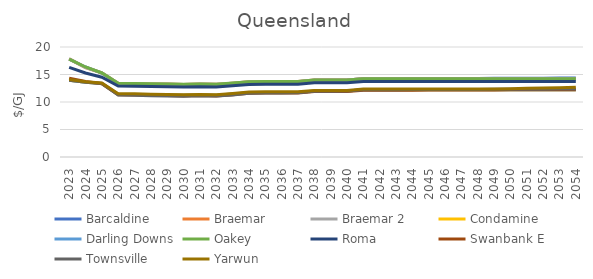
| Category | Barcaldine | Braemar | Braemar 2 | Condamine | Darling Downs | Oakey | Roma | Swanbank E | Townsville | Yarwun |
|---|---|---|---|---|---|---|---|---|---|---|
| 2023.0 | 17.787 | 17.827 | 17.827 | 13.967 | 13.967 | 17.787 | 16.302 | 14.339 | 13.967 | 14.078 |
| 2024.0 | 16.365 | 16.272 | 16.272 | 13.568 | 13.568 | 16.365 | 15.284 | 13.721 | 13.568 | 13.679 |
| 2025.0 | 15.277 | 15.318 | 15.318 | 13.348 | 13.348 | 15.277 | 14.503 | 13.317 | 13.348 | 13.459 |
| 2026.0 | 13.289 | 13.387 | 13.387 | 11.399 | 11.399 | 13.399 | 12.899 | 11.307 | 11.289 | 11.511 |
| 2027.0 | 13.224 | 13.359 | 13.359 | 11.372 | 11.372 | 13.372 | 12.872 | 11.266 | 11.224 | 11.486 |
| 2028.0 | 13.136 | 13.286 | 13.286 | 11.299 | 11.299 | 13.299 | 12.799 | 11.234 | 11.136 | 11.41 |
| 2029.0 | 13.113 | 13.257 | 13.257 | 11.271 | 11.271 | 13.271 | 12.771 | 11.166 | 11.113 | 11.386 |
| 2030.0 | 13.058 | 13.196 | 13.196 | 11.207 | 11.207 | 13.207 | 12.707 | 11.102 | 11.058 | 11.323 |
| 2031.0 | 13.126 | 13.263 | 13.263 | 11.27 | 11.27 | 13.27 | 12.77 | 11.166 | 11.126 | 11.386 |
| 2032.0 | 13.072 | 13.211 | 13.211 | 11.215 | 11.215 | 13.215 | 12.715 | 11.11 | 11.072 | 11.326 |
| 2033.0 | 13.29 | 13.432 | 13.432 | 11.435 | 11.435 | 13.435 | 12.935 | 11.331 | 11.29 | 11.546 |
| 2034.0 | 13.572 | 13.691 | 13.691 | 11.696 | 11.696 | 13.696 | 13.196 | 11.592 | 11.572 | 11.807 |
| 2035.0 | 13.636 | 13.744 | 13.744 | 11.747 | 11.747 | 13.747 | 13.247 | 11.642 | 11.636 | 11.858 |
| 2036.0 | 13.653 | 13.746 | 13.746 | 11.747 | 11.747 | 13.747 | 13.247 | 11.642 | 11.653 | 11.858 |
| 2037.0 | 13.672 | 13.747 | 13.747 | 11.747 | 11.747 | 13.747 | 13.247 | 11.642 | 11.672 | 11.858 |
| 2038.0 | 13.942 | 13.996 | 13.996 | 11.997 | 11.997 | 13.997 | 13.497 | 11.892 | 11.942 | 12.108 |
| 2039.0 | 13.974 | 13.992 | 13.992 | 11.997 | 11.997 | 13.997 | 13.497 | 11.892 | 11.974 | 12.108 |
| 2040.0 | 13.996 | 13.993 | 13.993 | 11.997 | 11.997 | 13.997 | 13.497 | 11.892 | 11.996 | 12.108 |
| 2041.0 | 14.246 | 14.244 | 14.244 | 12.247 | 12.247 | 14.247 | 13.747 | 12.142 | 12.246 | 12.358 |
| 2042.0 | 14.246 | 14.244 | 14.244 | 12.247 | 12.247 | 14.247 | 13.747 | 12.142 | 12.246 | 12.358 |
| 2043.0 | 14.246 | 14.248 | 14.248 | 12.247 | 12.247 | 14.247 | 13.747 | 12.142 | 12.246 | 12.358 |
| 2044.0 | 14.255 | 14.248 | 14.248 | 12.247 | 12.247 | 14.247 | 13.747 | 12.15 | 12.255 | 12.358 |
| 2045.0 | 14.277 | 14.244 | 14.244 | 12.247 | 12.247 | 14.247 | 13.747 | 12.173 | 12.277 | 12.358 |
| 2046.0 | 14.292 | 14.242 | 14.242 | 12.247 | 12.247 | 14.247 | 13.747 | 12.188 | 12.292 | 12.358 |
| 2047.0 | 14.292 | 14.241 | 14.241 | 12.247 | 12.247 | 14.247 | 13.747 | 12.186 | 12.292 | 12.358 |
| 2048.0 | 14.292 | 14.241 | 14.241 | 12.247 | 12.247 | 14.247 | 13.747 | 12.185 | 12.292 | 12.358 |
| 2049.0 | 14.307 | 14.244 | 14.244 | 12.247 | 12.247 | 14.247 | 13.747 | 12.199 | 12.307 | 12.358 |
| 2050.0 | 14.318 | 14.244 | 14.244 | 12.247 | 12.247 | 14.247 | 13.747 | 12.209 | 12.318 | 12.42 |
| 2051.0 | 14.329 | 14.243 | 14.243 | 12.247 | 12.247 | 14.247 | 13.747 | 12.219 | 12.329 | 12.482 |
| 2052.0 | 14.339 | 14.242 | 14.242 | 12.247 | 12.247 | 14.247 | 13.747 | 12.229 | 12.339 | 12.544 |
| 2053.0 | 14.35 | 14.241 | 14.241 | 12.247 | 12.247 | 14.247 | 13.747 | 12.238 | 12.35 | 12.607 |
| 2054.0 | 14.36 | 14.241 | 14.241 | 12.247 | 12.247 | 14.247 | 13.747 | 12.248 | 12.36 | 12.67 |